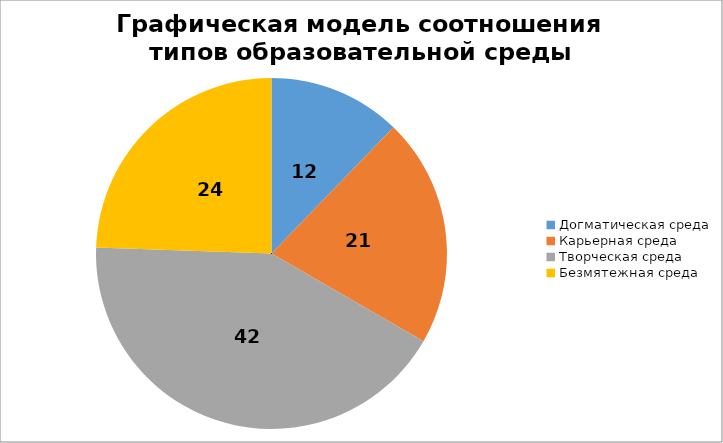
| Category | Графическая модель соотношения типов образовательной среды |
|---|---|
| Догматическая среда | 12.222 |
| Карьерная среда | 21.111 |
| Творческая среда | 42.222 |
| Безмятежная среда | 24.444 |